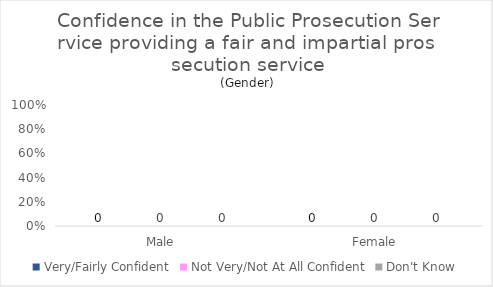
| Category | Very/Fairly Confident | Not Very/Not At All Confident | Don't Know |
|---|---|---|---|
| Male | 0 | 0 | 0 |
| Female | 0 | 0 | 0 |